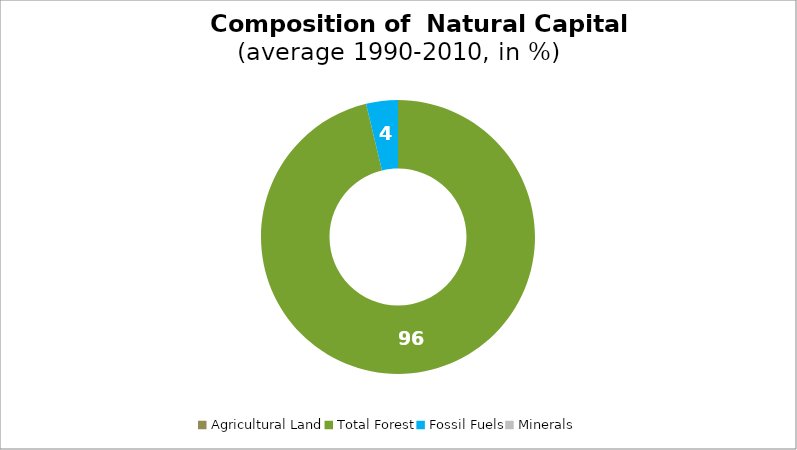
| Category | Series 0 |
|---|---|
| Agricultural Land | 0 |
| Total Forest | 96.253 |
| Fossil Fuels | 3.747 |
| Minerals | 0 |